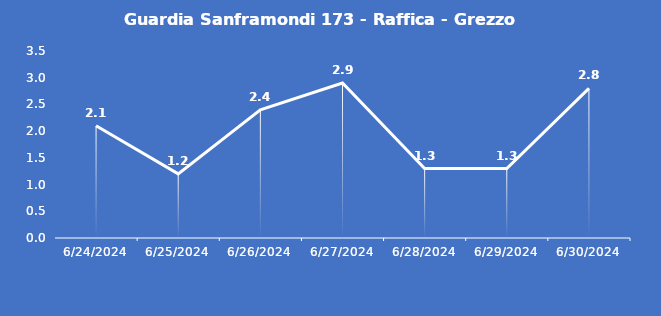
| Category | Guardia Sanframondi 173 - Raffica - Grezzo (m/s) |
|---|---|
| 6/24/24 | 2.1 |
| 6/25/24 | 1.2 |
| 6/26/24 | 2.4 |
| 6/27/24 | 2.9 |
| 6/28/24 | 1.3 |
| 6/29/24 | 1.3 |
| 6/30/24 | 2.8 |